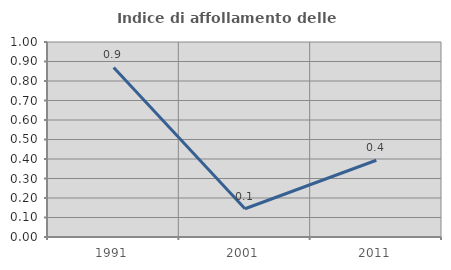
| Category | Indice di affollamento delle abitazioni  |
|---|---|
| 1991.0 | 0.87 |
| 2001.0 | 0.145 |
| 2011.0 | 0.394 |